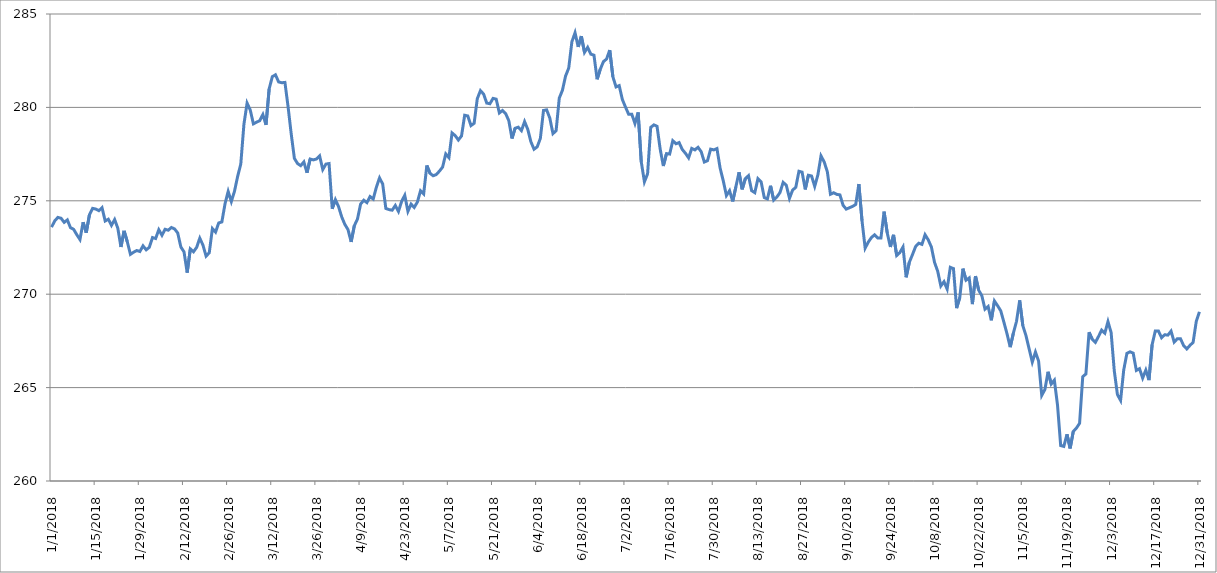
| Category | Series 0 |
|---|---|
| 01/01/2018 | 273.592 |
| 02/01/2018 | 273.926 |
| 03/01/2018 | 274.111 |
| 04/01/2018 | 274.065 |
| 05/01/2018 | 273.847 |
| 06/01/2018 | 273.977 |
| 07/01/2018 | 273.56 |
| 08/01/2018 | 273.473 |
| 09/01/2018 | 273.182 |
| 10/01/2018 | 272.926 |
| 11/01/2018 | 273.852 |
| 12/01/2018 | 273.294 |
| 13/01/2018 | 274.245 |
| 14/01/2018 | 274.595 |
| 15/01/2018 | 274.56 |
| 16/01/2018 | 274.471 |
| 17/01/2018 | 274.63 |
| 18/01/2018 | 273.919 |
| 19/01/2018 | 274.015 |
| 20/01/2018 | 273.687 |
| 21/01/2018 | 273.995 |
| 22/01/2018 | 273.536 |
| 23/01/2018 | 272.529 |
| 24/01/2018 | 273.391 |
| 25/01/2018 | 272.813 |
| 26/01/2018 | 272.135 |
| 27/01/2018 | 272.247 |
| 28/01/2018 | 272.339 |
| 29/01/2018 | 272.286 |
| 30/01/2018 | 272.589 |
| 31/01/2018 | 272.375 |
| 01/02/2018 | 272.512 |
| 02/02/2018 | 273.032 |
| 03/02/2018 | 272.981 |
| 04/02/2018 | 273.451 |
| 05/02/2018 | 273.156 |
| 06/02/2018 | 273.476 |
| 07/02/2018 | 273.426 |
| 08/02/2018 | 273.572 |
| 09/02/2018 | 273.495 |
| 10/02/2018 | 273.277 |
| 11/02/2018 | 272.525 |
| 12/02/2018 | 272.268 |
| 13/02/2018 | 271.155 |
| 14/02/2018 | 272.424 |
| 15/02/2018 | 272.269 |
| 16/02/2018 | 272.506 |
| 17/02/2018 | 272.999 |
| 18/02/2018 | 272.629 |
| 19/02/2018 | 272.037 |
| 20/02/2018 | 272.217 |
| 21/02/2018 | 273.513 |
| 22/02/2018 | 273.324 |
| 23/02/2018 | 273.815 |
| 24/02/2018 | 273.87 |
| 25/02/2018 | 274.836 |
| 26/02/2018 | 275.502 |
| 27/02/2018 | 274.96 |
| 28/02/2018 | 275.508 |
| 01/03/2018 | 276.304 |
| 02/03/2018 | 276.968 |
| 03/03/2018 | 279.101 |
| 04/03/2018 | 280.23 |
| 05/03/2018 | 279.862 |
| 06/03/2018 | 279.119 |
| 07/03/2018 | 279.208 |
| 08/03/2018 | 279.289 |
| 09/03/2018 | 279.617 |
| 10/03/2018 | 279.063 |
| 11/03/2018 | 280.99 |
| 12/03/2018 | 281.646 |
| 13/03/2018 | 281.745 |
| 14/03/2018 | 281.363 |
| 15/03/2018 | 281.32 |
| 16/03/2018 | 281.338 |
| 17/03/2018 | 280.034 |
| 18/03/2018 | 278.571 |
| 19/03/2018 | 277.272 |
| 20/03/2018 | 276.995 |
| 21/03/2018 | 276.882 |
| 22/03/2018 | 277.081 |
| 23/03/2018 | 276.502 |
| 24/03/2018 | 277.236 |
| 25/03/2018 | 277.19 |
| 26/03/2018 | 277.238 |
| 27/03/2018 | 277.406 |
| 28/03/2018 | 276.673 |
| 29/03/2018 | 276.965 |
| 30/03/2018 | 276.995 |
| 31/03/2018 | 274.575 |
| 01/04/2018 | 275.061 |
| 02/04/2018 | 274.691 |
| 03/04/2018 | 274.142 |
| 04/04/2018 | 273.736 |
| 05/04/2018 | 273.459 |
| 06/04/2018 | 272.8 |
| 07/04/2018 | 273.663 |
| 08/04/2018 | 274.023 |
| 09/04/2018 | 274.824 |
| 10/04/2018 | 275.031 |
| 11/04/2018 | 274.901 |
| 12/04/2018 | 275.227 |
| 13/04/2018 | 275.095 |
| 14/04/2018 | 275.731 |
| 15/04/2018 | 276.225 |
| 16/04/2018 | 275.9 |
| 17/04/2018 | 274.591 |
| 18/04/2018 | 274.529 |
| 19/04/2018 | 274.498 |
| 20/04/2018 | 274.751 |
| 21/04/2018 | 274.431 |
| 22/04/2018 | 274.966 |
| 23/04/2018 | 275.297 |
| 24/04/2018 | 274.436 |
| 25/04/2018 | 274.821 |
| 26/04/2018 | 274.645 |
| 27/04/2018 | 274.932 |
| 28/04/2018 | 275.536 |
| 29/04/2018 | 275.364 |
| 30/04/2018 | 276.891 |
| 01/05/2018 | 276.474 |
| 02/05/2018 | 276.34 |
| 03/05/2018 | 276.405 |
| 04/05/2018 | 276.59 |
| 05/05/2018 | 276.805 |
| 06/05/2018 | 277.51 |
| 07/05/2018 | 277.311 |
| 08/05/2018 | 278.632 |
| 09/05/2018 | 278.488 |
| 10/05/2018 | 278.255 |
| 11/05/2018 | 278.473 |
| 12/05/2018 | 279.581 |
| 13/05/2018 | 279.541 |
| 14/05/2018 | 279.026 |
| 15/05/2018 | 279.15 |
| 16/05/2018 | 280.465 |
| 17/05/2018 | 280.898 |
| 18/05/2018 | 280.714 |
| 19/05/2018 | 280.231 |
| 20/05/2018 | 280.195 |
| 21/05/2018 | 280.484 |
| 22/05/2018 | 280.441 |
| 23/05/2018 | 279.703 |
| 24/05/2018 | 279.837 |
| 25/05/2018 | 279.668 |
| 26/05/2018 | 279.286 |
| 27/05/2018 | 278.335 |
| 28/05/2018 | 278.886 |
| 29/05/2018 | 278.942 |
| 30/05/2018 | 278.757 |
| 31/05/2018 | 279.24 |
| 01/06/2018 | 278.828 |
| 02/06/2018 | 278.16 |
| 03/06/2018 | 277.76 |
| 04/06/2018 | 277.887 |
| 05/06/2018 | 278.341 |
| 06/06/2018 | 279.837 |
| 07/06/2018 | 279.868 |
| 08/06/2018 | 279.425 |
| 09/06/2018 | 278.595 |
| 10/06/2018 | 278.76 |
| 11/06/2018 | 280.499 |
| 12/06/2018 | 280.918 |
| 13/06/2018 | 281.682 |
| 14/06/2018 | 282.107 |
| 15/06/2018 | 283.515 |
| 16/06/2018 | 283.997 |
| 17/06/2018 | 283.238 |
| 18/06/2018 | 283.815 |
| 19/06/2018 | 282.946 |
| 20/06/2018 | 283.214 |
| 21/06/2018 | 282.852 |
| 22/06/2018 | 282.795 |
| 23/06/2018 | 281.506 |
| 24/06/2018 | 282.039 |
| 25/06/2018 | 282.449 |
| 26/06/2018 | 282.592 |
| 27/06/2018 | 283.069 |
| 28/06/2018 | 281.64 |
| 29/06/2018 | 281.096 |
| 30/06/2018 | 281.167 |
| 01/07/2018 | 280.424 |
| 02/07/2018 | 280.016 |
| 03/07/2018 | 279.633 |
| 04/07/2018 | 279.633 |
| 05/07/2018 | 279.138 |
| 06/07/2018 | 279.731 |
| 07/07/2018 | 277.086 |
| 08/07/2018 | 276.015 |
| 09/07/2018 | 276.444 |
| 10/07/2018 | 278.93 |
| 11/07/2018 | 279.065 |
| 12/07/2018 | 278.989 |
| 13/07/2018 | 277.765 |
| 14/07/2018 | 276.862 |
| 15/07/2018 | 277.526 |
| 16/07/2018 | 277.502 |
| 17/07/2018 | 278.218 |
| 18/07/2018 | 278.053 |
| 19/07/2018 | 278.117 |
| 20/07/2018 | 277.749 |
| 21/07/2018 | 277.546 |
| 22/07/2018 | 277.301 |
| 23/07/2018 | 277.807 |
| 24/07/2018 | 277.725 |
| 25/07/2018 | 277.864 |
| 26/07/2018 | 277.629 |
| 27/07/2018 | 277.075 |
| 28/07/2018 | 277.148 |
| 29/07/2018 | 277.767 |
| 30/07/2018 | 277.725 |
| 31/07/2018 | 277.796 |
| 01/08/2018 | 276.753 |
| 02/08/2018 | 276.073 |
| 03/08/2018 | 275.282 |
| 04/08/2018 | 275.542 |
| 05/08/2018 | 274.967 |
| 06/08/2018 | 275.747 |
| 07/08/2018 | 276.524 |
| 08/08/2018 | 275.615 |
| 09/08/2018 | 276.185 |
| 10/08/2018 | 276.345 |
| 11/08/2018 | 275.543 |
| 12/08/2018 | 275.435 |
| 13/08/2018 | 276.188 |
| 14/08/2018 | 276.02 |
| 15/08/2018 | 275.174 |
| 16/08/2018 | 275.101 |
| 17/08/2018 | 275.805 |
| 18/08/2018 | 275.037 |
| 19/08/2018 | 275.202 |
| 20/08/2018 | 275.445 |
| 21/08/2018 | 275.988 |
| 22/08/2018 | 275.827 |
| 23/08/2018 | 275.133 |
| 24/08/2018 | 275.575 |
| 25/08/2018 | 275.722 |
| 26/08/2018 | 276.581 |
| 27/08/2018 | 276.534 |
| 28/08/2018 | 275.609 |
| 29/08/2018 | 276.369 |
| 30/08/2018 | 276.328 |
| 31/08/2018 | 275.772 |
| 01/09/2018 | 276.384 |
| 02/09/2018 | 277.402 |
| 03/09/2018 | 277.084 |
| 04/09/2018 | 276.557 |
| 05/09/2018 | 275.349 |
| 06/09/2018 | 275.431 |
| 07/09/2018 | 275.343 |
| 08/09/2018 | 275.316 |
| 09/09/2018 | 274.761 |
| 10/09/2018 | 274.554 |
| 11/09/2018 | 274.628 |
| 12/09/2018 | 274.7 |
| 13/09/2018 | 274.801 |
| 14/09/2018 | 275.896 |
| 15/09/2018 | 273.939 |
| 16/09/2018 | 272.466 |
| 17/09/2018 | 272.792 |
| 18/09/2018 | 273.036 |
| 19/09/2018 | 273.181 |
| 20/09/2018 | 273.012 |
| 21/09/2018 | 273.008 |
| 22/09/2018 | 274.419 |
| 23/09/2018 | 273.282 |
| 24/09/2018 | 272.527 |
| 25/09/2018 | 273.178 |
| 26/09/2018 | 272.073 |
| 27/09/2018 | 272.228 |
| 28/09/2018 | 272.526 |
| 29/09/2018 | 270.906 |
| 30/09/2018 | 271.706 |
| 01/10/2018 | 272.118 |
| 02/10/2018 | 272.552 |
| 03/10/2018 | 272.73 |
| 04/10/2018 | 272.668 |
| 05/10/2018 | 273.183 |
| 06/10/2018 | 272.91 |
| 07/10/2018 | 272.527 |
| 08/10/2018 | 271.704 |
| 09/10/2018 | 271.23 |
| 10/10/2018 | 270.439 |
| 11/10/2018 | 270.669 |
| 12/10/2018 | 270.277 |
| 13/10/2018 | 271.439 |
| 14/10/2018 | 271.37 |
| 15/10/2018 | 269.255 |
| 16/10/2018 | 269.817 |
| 17/10/2018 | 271.367 |
| 18/10/2018 | 270.752 |
| 19/10/2018 | 270.871 |
| 20/10/2018 | 269.47 |
| 21/10/2018 | 270.968 |
| 22/10/2018 | 270.214 |
| 23/10/2018 | 269.921 |
| 24/10/2018 | 269.199 |
| 25/10/2018 | 269.342 |
| 26/10/2018 | 268.602 |
| 27/10/2018 | 269.635 |
| 28/10/2018 | 269.384 |
| 29/10/2018 | 269.108 |
| 30/10/2018 | 268.5 |
| 31/10/2018 | 267.872 |
| 01/11/2018 | 267.165 |
| 02/11/2018 | 267.913 |
| 03/11/2018 | 268.551 |
| 04/11/2018 | 269.67 |
| 05/11/2018 | 268.318 |
| 06/11/2018 | 267.784 |
| 07/11/2018 | 267.072 |
| 08/11/2018 | 266.364 |
| 09/11/2018 | 266.907 |
| 10/11/2018 | 266.422 |
| 11/11/2018 | 264.586 |
| 12/11/2018 | 264.895 |
| 13/11/2018 | 265.848 |
| 14/11/2018 | 265.193 |
| 15/11/2018 | 265.396 |
| 16/11/2018 | 264.064 |
| 17/11/2018 | 261.903 |
| 18/11/2018 | 261.857 |
| 19/11/2018 | 262.502 |
| 20/11/2018 | 261.746 |
| 21/11/2018 | 262.656 |
| 22/11/2018 | 262.832 |
| 23/11/2018 | 263.094 |
| 24/11/2018 | 265.587 |
| 25/11/2018 | 265.733 |
| 26/11/2018 | 267.963 |
| 27/11/2018 | 267.591 |
| 28/11/2018 | 267.421 |
| 29/11/2018 | 267.737 |
| 30/11/2018 | 268.077 |
| 01/12/2018 | 267.913 |
| 02/12/2018 | 268.534 |
| 03/12/2018 | 267.945 |
| 04/12/2018 | 265.899 |
| 05/12/2018 | 264.624 |
| 06/12/2018 | 264.315 |
| 07/12/2018 | 265.95 |
| 08/12/2018 | 266.831 |
| 09/12/2018 | 266.915 |
| 10/12/2018 | 266.843 |
| 11/12/2018 | 265.919 |
| 12/12/2018 | 266.014 |
| 13/12/2018 | 265.513 |
| 14/12/2018 | 265.938 |
| 15/12/2018 | 265.401 |
| 16/12/2018 | 267.298 |
| 17/12/2018 | 268.028 |
| 18/12/2018 | 268.029 |
| 19/12/2018 | 267.671 |
| 20/12/2018 | 267.831 |
| 21/12/2018 | 267.809 |
| 22/12/2018 | 268.023 |
| 23/12/2018 | 267.436 |
| 24/12/2018 | 267.616 |
| 25/12/2018 | 267.616 |
| 26/12/2018 | 267.245 |
| 27/12/2018 | 267.07 |
| 28/12/2018 | 267.26 |
| 29/12/2018 | 267.424 |
| 30/12/2018 | 268.544 |
| 31/12/2018 | 269.058 |